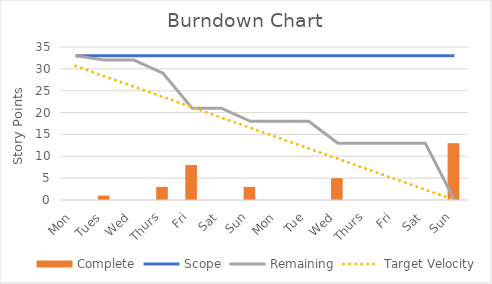
| Category | Complete |
|---|---|
| Mon | 0 |
| Tues | 1 |
| Wed | 0 |
| Thurs | 3 |
| Fri | 8 |
| Sat | 0 |
| Sun | 3 |
| Mon | 0 |
| Tue | 0 |
| Wed | 5 |
| Thurs | 0 |
| Fri | 0 |
| Sat | 0 |
| Sun | 13 |